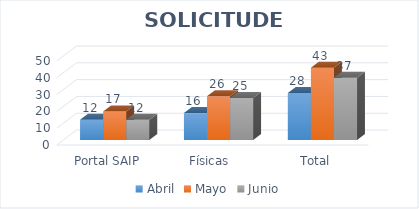
| Category | Abril | Mayo | Junio |
|---|---|---|---|
| Portal SAIP | 12 | 17 | 12 |
| Físicas  | 16 | 26 | 25 |
| Total | 28 | 43 | 37 |